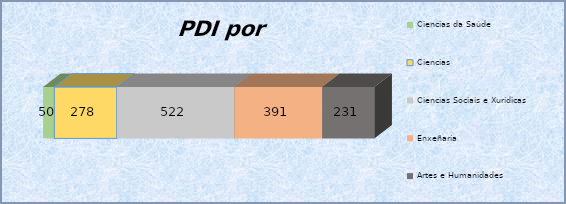
| Category | Ciencias da Saúde | Ciencias | Ciencias Sociais e Xurídicas | Enxeñaría | Artes e Humanidades |
|---|---|---|---|---|---|
| 0 | 50 | 278 | 522 | 391 | 231 |